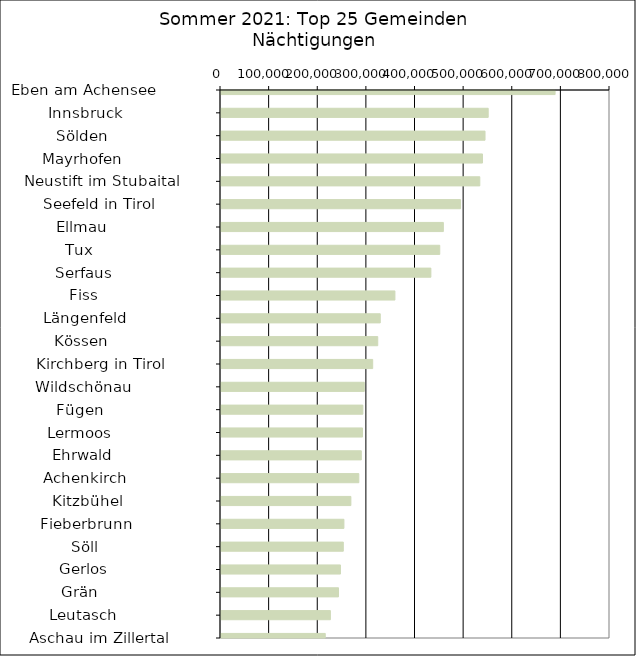
| Category | Series 0 |
|---|---|
|   Eben am Achensee           | 687092 |
|   Innsbruck                  | 549486 |
|   Sölden                     | 542966 |
|   Mayrhofen                  | 537749 |
|   Neustift im Stubaital      | 532236 |
|   Seefeld in Tirol           | 492622 |
|   Ellmau                     | 457287 |
|   Tux                        | 449876 |
|   Serfaus                    | 431616 |
|   Fiss                       | 357656 |
|   Längenfeld                 | 327517 |
|   Kössen                     | 322364 |
|   Kirchberg in Tirol         | 311965 |
|   Wildschönau                | 294694 |
|   Fügen                      | 291720 |
|   Lermoos                    | 291003 |
|   Ehrwald                    | 288547 |
|   Achenkirch                 | 283436 |
|   Kitzbühel                  | 267095 |
|   Fieberbrunn                | 252782 |
|   Söll                       | 251531 |
|   Gerlos                     | 245644 |
|   Grän                       | 241641 |
|   Leutasch                   | 224963 |
|   Aschau im Zillertal        | 214417 |